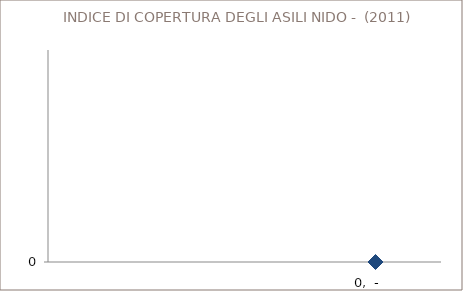
| Category | Indice di copertura degli asili nido (*) |
|---|---|
| 0 | 0 |
| 1 | 0 |
| 2 | 0 |